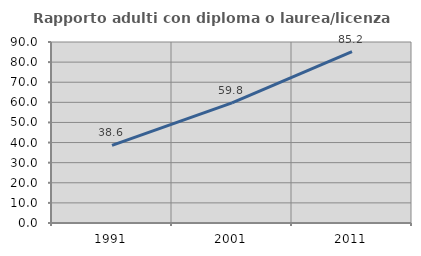
| Category | Rapporto adulti con diploma o laurea/licenza media  |
|---|---|
| 1991.0 | 38.612 |
| 2001.0 | 59.756 |
| 2011.0 | 85.244 |